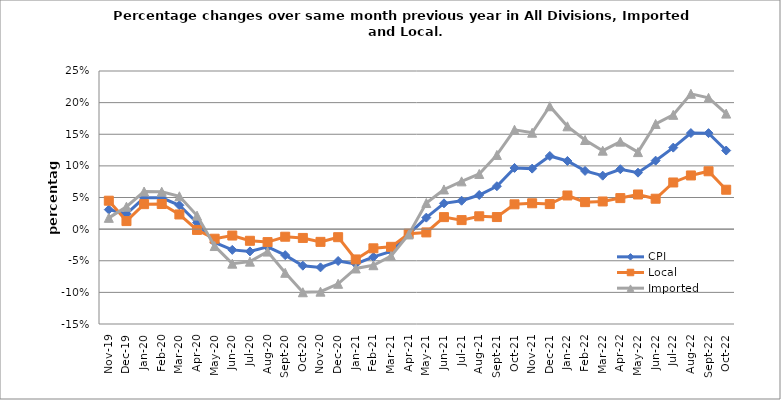
| Category | CPI | Local | Imported |
|---|---|---|---|
| 2019-11-01 | 0.031 | 0.045 | 0.018 |
| 2019-12-01 | 0.024 | 0.013 | 0.035 |
| 2020-01-01 | 0.049 | 0.039 | 0.059 |
| 2020-02-01 | 0.05 | 0.04 | 0.059 |
| 2020-03-01 | 0.038 | 0.023 | 0.052 |
| 2020-04-01 | 0.01 | -0.001 | 0.021 |
| 2020-05-01 | -0.021 | -0.015 | -0.027 |
| 2020-06-01 | -0.033 | -0.01 | -0.055 |
| 2020-07-01 | -0.035 | -0.018 | -0.051 |
| 2020-08-01 | -0.028 | -0.02 | -0.036 |
| 2020-09-01 | -0.041 | -0.012 | -0.069 |
| 2020-10-01 | -0.058 | -0.014 | -0.1 |
| 2020-11-01 | -0.06 | -0.02 | -0.099 |
| 2020-12-01 | -0.05 | -0.013 | -0.086 |
| 2021-01-01 | -0.055 | -0.048 | -0.062 |
| 2021-02-01 | -0.044 | -0.03 | -0.057 |
| 2021-03-01 | -0.035 | -0.028 | -0.043 |
| 2021-04-01 | -0.008 | -0.007 | -0.008 |
| 2021-05-01 | 0.018 | -0.005 | 0.041 |
| 2021-06-01 | 0.041 | 0.019 | 0.063 |
| 2021-07-01 | 0.045 | 0.014 | 0.075 |
| 2021-08-01 | 0.054 | 0.02 | 0.087 |
| 2021-09-01 | 0.068 | 0.019 | 0.117 |
| 2021-10-01 | 0.097 | 0.039 | 0.157 |
| 2021-11-01 | 0.096 | 0.041 | 0.152 |
| 2021-12-01 | 0.116 | 0.04 | 0.194 |
| 2022-01-01 | 0.108 | 0.053 | 0.163 |
| 2022-02-01 | 0.092 | 0.043 | 0.141 |
| 2022-03-01 | 0.085 | 0.044 | 0.124 |
| 2022-04-01 | 0.095 | 0.049 | 0.138 |
| 2022-05-01 | 0.089 | 0.055 | 0.122 |
| 2022-06-01 | 0.108 | 0.048 | 0.166 |
| 2022-07-01 | 0.129 | 0.074 | 0.181 |
| 2022-08-01 | 0.152 | 0.085 | 0.214 |
| 2022-09-01 | 0.152 | 0.091 | 0.208 |
| 2022-10-01 | 0.124 | 0.062 | 0.183 |